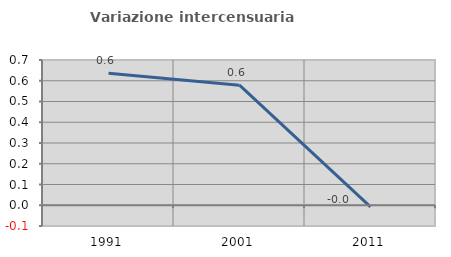
| Category | Variazione intercensuaria annua |
|---|---|
| 1991.0 | 0.636 |
| 2001.0 | 0.579 |
| 2011.0 | -0.008 |